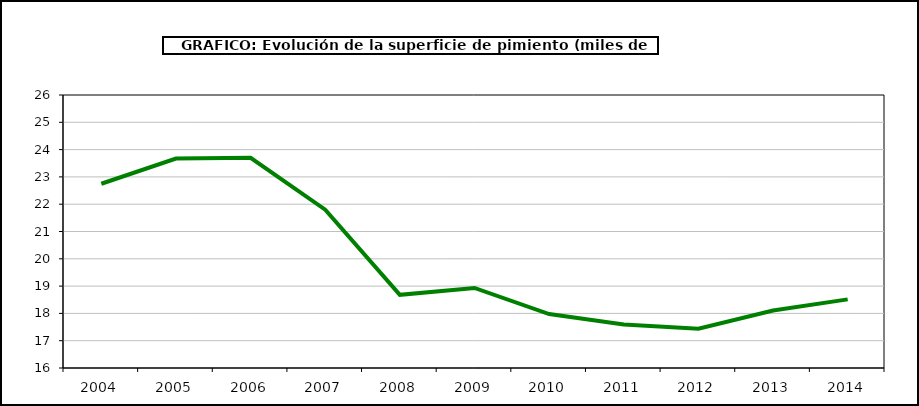
| Category | superficie |
|---|---|
| 2004.0 | 22.749 |
| 2005.0 | 23.672 |
| 2006.0 | 23.699 |
| 2007.0 | 21.798 |
| 2008.0 | 18.681 |
| 2009.0 | 18.931 |
| 2010.0 | 17.975 |
| 2011.0 | 17.595 |
| 2012.0 | 17.44 |
| 2013.0 | 18.108 |
| 2014.0 | 18.513 |